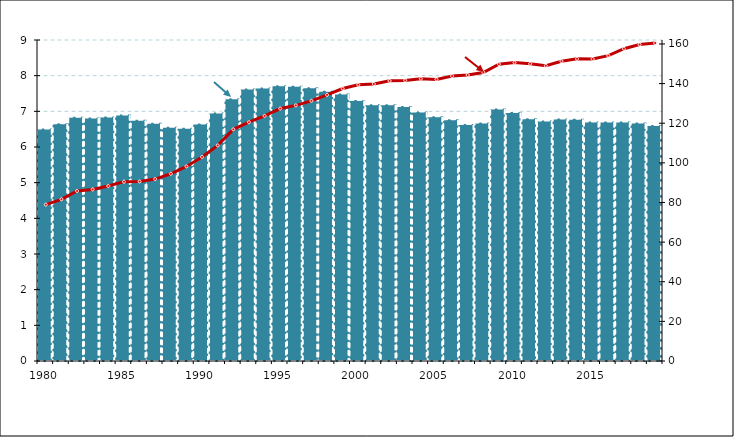
| Category | DIE/PIB |
|---|---|
| 1980 | 6.518 |
| 1981 | 6.668 |
| 1982 | 6.847 |
| 1983 | 6.827 |
| 1984 | 6.854 |
| 1985 | 6.909 |
| 1986 | 6.763 |
| 1987 | 6.678 |
| 1988 | 6.567 |
| 1989 | 6.54 |
| 1990 | 6.661 |
| 1991 | 6.966 |
| 1992 | 7.363 |
| 1993 | 7.639 |
| 1994 | 7.665 |
| 1995 | 7.728 |
| 1996 | 7.718 |
| 1997 | 7.675 |
| 1998 | 7.578 |
| 1999 | 7.503 |
| 2000 | 7.318 |
| 2001 | 7.198 |
| 2002 | 7.2 |
| 2003 | 7.149 |
| 2004 | 6.996 |
| 2005 | 6.865 |
| 2006 | 6.779 |
| 2007 | 6.642 |
| 2008 | 6.685 |
| 2009 | 7.081 |
| 2010 | 6.983 |
| 2011 | 6.806 |
| 2012 | 6.74 |
| 2013 | 6.801 |
| 2014 | 6.794 |
| 2015 | 6.715 |
| 2016 | 6.717 |
| 2017 | 6.714 |
| 2018 | 6.685 |
| 2019p | 6.617 |